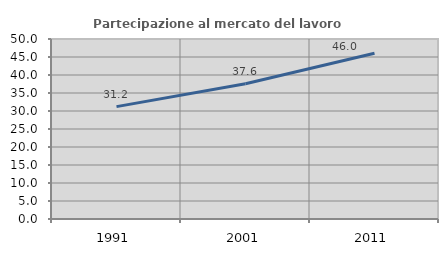
| Category | Partecipazione al mercato del lavoro  femminile |
|---|---|
| 1991.0 | 31.214 |
| 2001.0 | 37.565 |
| 2011.0 | 46.04 |